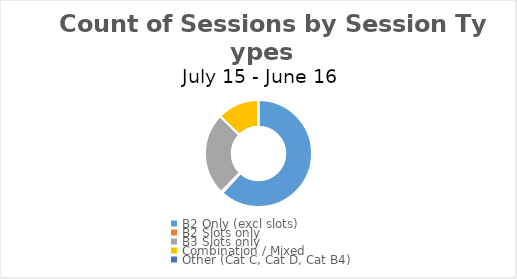
| Category | Series 0 |
|---|---|
| B2 Only (excl slots) | 128168215 |
| B2 Slots only | 999521 |
| B3 Slots only | 51728837 |
| Combination / Mixed | 26068600 |
| Other (Cat C, Cat D, Cat B4) | 320390 |